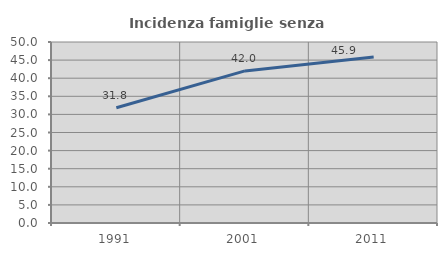
| Category | Incidenza famiglie senza nuclei |
|---|---|
| 1991.0 | 31.839 |
| 2001.0 | 42.009 |
| 2011.0 | 45.854 |